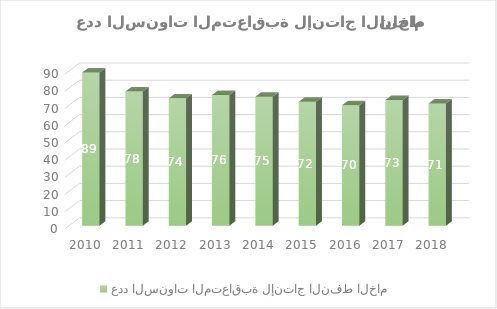
| Category | عدد السنوات المتعاقبة لإنتاج النفط الخام |
|---|---|
| 2010.0 | 89 |
| 2011.0 | 78 |
| 2012.0 | 74 |
| 2013.0 | 76 |
| 2014.0 | 75 |
| 2015.0 | 72 |
| 2016.0 | 70 |
| 2017.0 | 73 |
| 2018.0 | 71 |